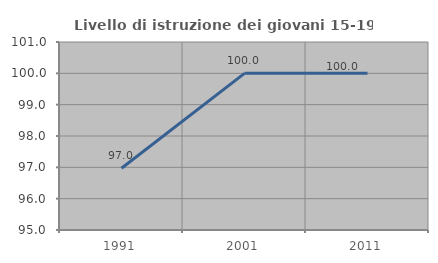
| Category | Livello di istruzione dei giovani 15-19 anni |
|---|---|
| 1991.0 | 96.97 |
| 2001.0 | 100 |
| 2011.0 | 100 |